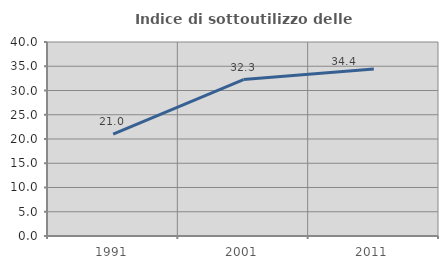
| Category | Indice di sottoutilizzo delle abitazioni  |
|---|---|
| 1991.0 | 20.997 |
| 2001.0 | 32.258 |
| 2011.0 | 34.435 |